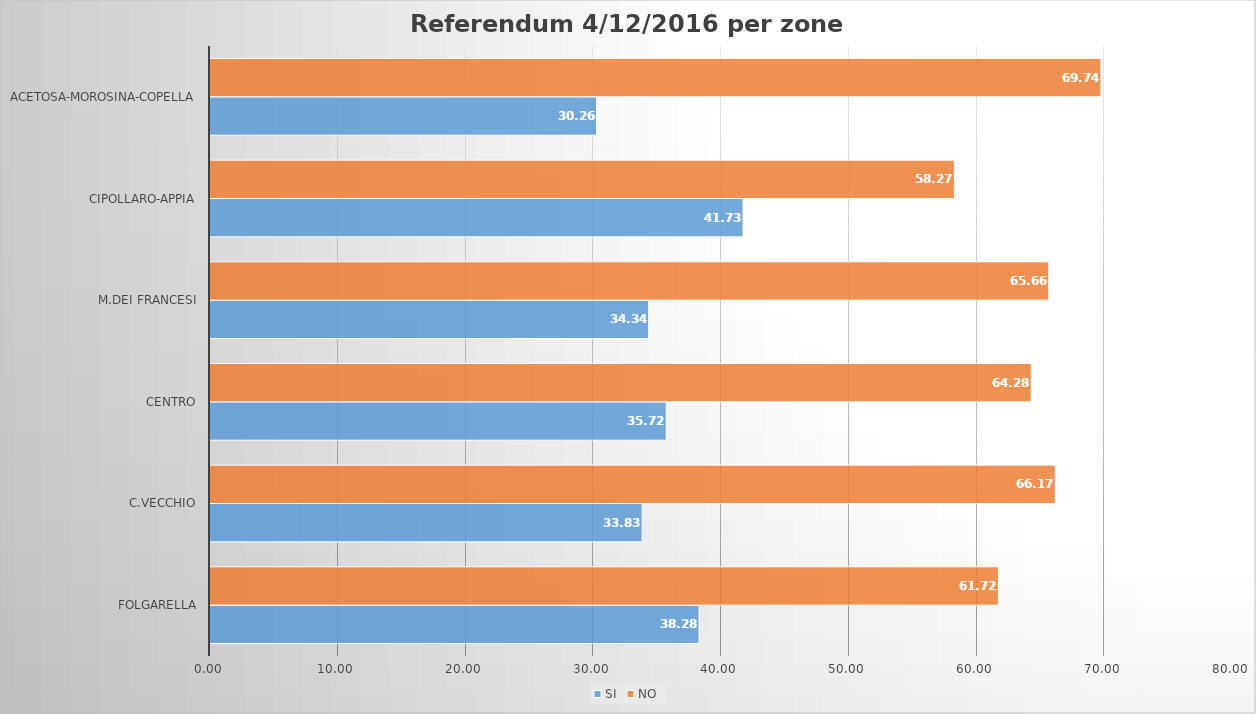
| Category | SI | NO |
|---|---|---|
| Folgarella | 38.283 | 61.717 |
| C.vecchio | 33.829 | 66.171 |
| Centro | 35.716 | 64.284 |
| M.dei Francesi | 34.342 | 65.658 |
| Cipollaro-appia | 41.726 | 58.274 |
| Acetosa-morosina-copella | 30.257 | 69.743 |